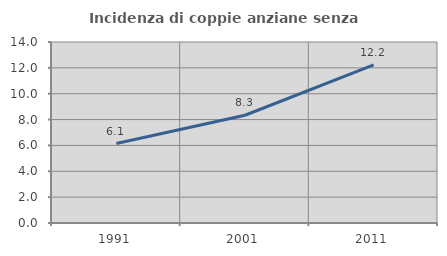
| Category | Incidenza di coppie anziane senza figli  |
|---|---|
| 1991.0 | 6.147 |
| 2001.0 | 8.333 |
| 2011.0 | 12.227 |